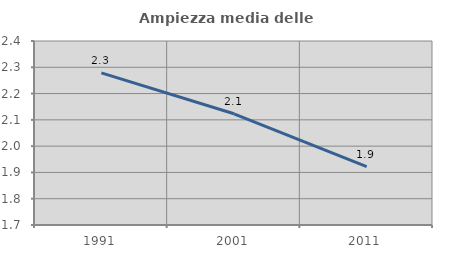
| Category | Ampiezza media delle famiglie |
|---|---|
| 1991.0 | 2.279 |
| 2001.0 | 2.123 |
| 2011.0 | 1.922 |